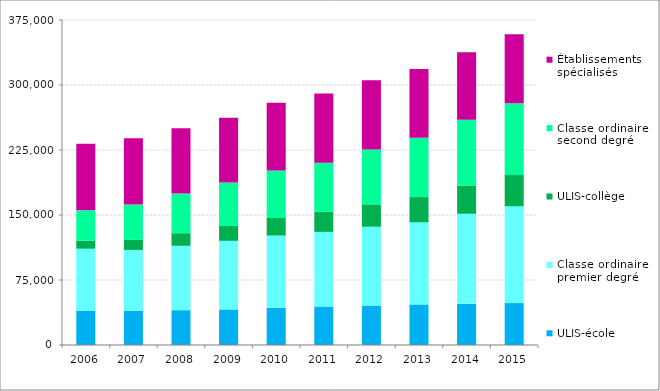
| Category | ULIS-école | Classe ordinaire premier degré | ULIS-collège | Classe ordinaire second degré | Établissements spécialisés  |
|---|---|---|---|---|---|
| 2006.0 | 39684 | 71399 | 9350 | 34928 | 76951 |
| 2007.0 | 39634 | 70048 | 11574 | 40760 | 76413 |
| 2008.0 | 40231 | 74251 | 14494 | 45697 | 75504 |
| 2009.0 | 41051 | 79129 | 17185 | 50125 | 74845 |
| 2010.0 | 42985 | 83309 | 20229 | 54865 | 78112 |
| 2011.0 | 44428 | 86089 | 23159 | 56719 | 79778 |
| 2012.0 | 45521 | 90900 | 25881 | 63261 | 79873 |
| 2013.0 | 46783 | 94782 | 29122 | 68473 | 79217 |
| 2014.0 | 47504 | 103908 | 32588 | 75941 | 77962 |
| 2015.0 | 48361 | 111682 | 36060 | 82875 | 79714 |